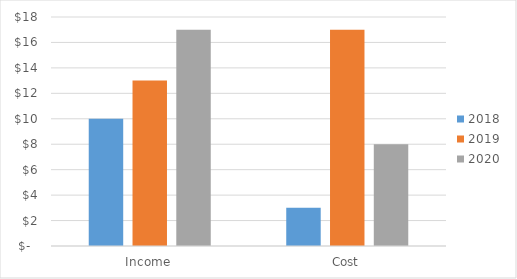
| Category | 2018 | 2019 | 2020 |
|---|---|---|---|
| Income | 10 | 13 | 17 |
| Cost | 3 | 17 | 8 |